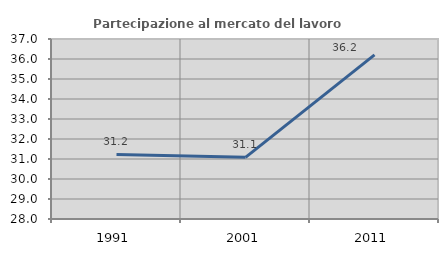
| Category | Partecipazione al mercato del lavoro  femminile |
|---|---|
| 1991.0 | 31.231 |
| 2001.0 | 31.084 |
| 2011.0 | 36.204 |